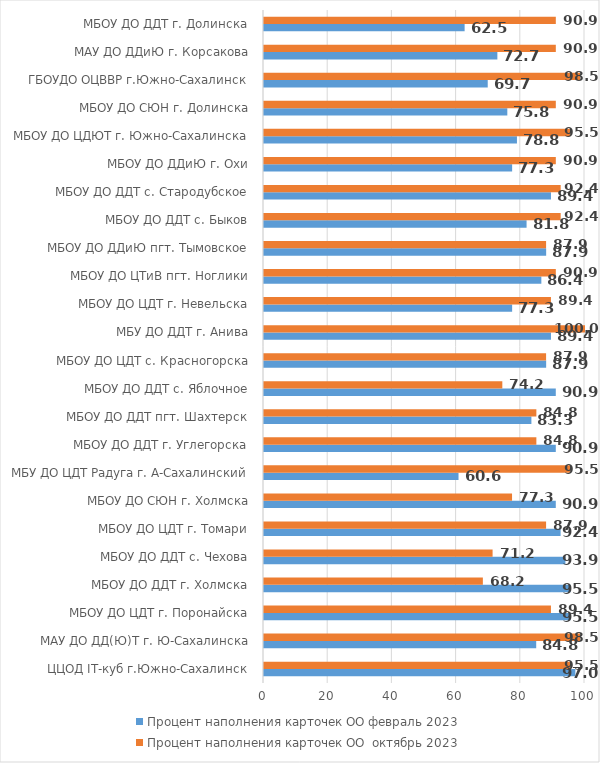
| Category | Процент наполнения карточек ОО февраль 2023 | Процент наполнения карточек ОО  октябрь 2023 |
|---|---|---|
| ЦЦОД IT-куб г.Южно-Сахалинск | 97 | 95.455 |
| МАУ ДО ДД(Ю)Т г. Ю-Сахалинска | 84.8 | 98.485 |
| МБОУ ДО ЦДТ г. Поронайска | 95.5 | 89.394 |
| МБОУ ДО ДДТ г. Холмска | 95.5 | 68.182 |
| МБОУ ДО ДДТ с. Чехова | 93.9 | 71.212 |
| МБОУ ДО ЦДТ г. Томари | 92.4 | 87.879 |
| МБОУ ДО СЮН г. Холмска | 90.9 | 77.273 |
| МБУ ДО ЦДТ Радуга г. А-Сахалинский | 60.6 | 95.455 |
| МБОУ ДО ДДТ г. Углегорска | 90.9 | 84.848 |
| МБОУ ДО ДДТ пгт. Шахтерск | 83.3 | 84.848 |
| МБОУ ДО ДДТ с. Яблочное | 90.9 | 74.242 |
| МБОУ ДО ЦДТ с. Красногорска | 87.9 | 87.879 |
| МБУ ДО ДДТ г. Анива | 89.4 | 100 |
| МБОУ ДО ЦДТ г. Невельска | 77.3 | 89.394 |
| МБОУ ДО ЦТиВ пгт. Ноглики | 86.4 | 90.909 |
| МБОУ ДО ДДиЮ пгт. Тымовское | 87.9 | 87.879 |
| МБОУ ДО ДДТ с. Быков | 81.8 | 92.424 |
| МБОУ ДО ДДТ с. Стародубское | 89.4 | 92.424 |
| МБОУ ДО ДДиЮ г. Охи | 77.3 | 90.909 |
| МБОУ ДО ЦДЮТ г. Южно-Сахалинска | 78.8 | 95.455 |
| МБОУ ДО СЮН г. Долинска | 75.8 | 90.909 |
| ГБОУДО ОЦВВР г.Южно-Сахалинск | 69.7 | 98.485 |
| МАУ ДО ДДиЮ г. Корсакова | 72.7 | 90.909 |
| МБОУ ДО ДДТ г. Долинска | 62.5 | 90.909 |